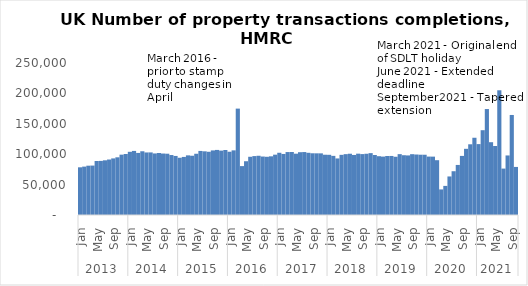
| Category | Series 0 |
|---|---|
| 0 | 78440 |
| 1 | 79580 |
| 2 | 81100 |
| 3 | 81280 |
| 4 | 88860 |
| 5 | 88970 |
| 6 | 89950 |
| 7 | 91250 |
| 8 | 93090 |
| 9 | 94890 |
| 10 | 99240 |
| 11 | 100330 |
| 12 | 103940 |
| 13 | 105390 |
| 14 | 102090 |
| 15 | 104820 |
| 16 | 102860 |
| 17 | 102930 |
| 18 | 101230 |
| 19 | 102020 |
| 20 | 101100 |
| 21 | 100800 |
| 22 | 98630 |
| 23 | 97130 |
| 24 | 94140 |
| 25 | 95520 |
| 26 | 98080 |
| 27 | 97470 |
| 28 | 100720 |
| 29 | 105360 |
| 30 | 104740 |
| 31 | 103990 |
| 32 | 106230 |
| 33 | 107030 |
| 34 | 105880 |
| 35 | 106870 |
| 36 | 104030 |
| 37 | 106340 |
| 38 | 174980 |
| 39 | 80430 |
| 40 | 88440 |
| 41 | 95770 |
| 42 | 96910 |
| 43 | 97430 |
| 44 | 96170 |
| 45 | 95750 |
| 46 | 96510 |
| 47 | 99220 |
| 48 | 102360 |
| 49 | 100400 |
| 50 | 103510 |
| 51 | 103620 |
| 52 | 100820 |
| 53 | 103280 |
| 54 | 103530 |
| 55 | 102310 |
| 56 | 101510 |
| 57 | 101430 |
| 58 | 101390 |
| 59 | 99140 |
| 60 | 99010 |
| 61 | 97250 |
| 62 | 93020 |
| 63 | 98940 |
| 64 | 100080 |
| 65 | 100770 |
| 66 | 98770 |
| 67 | 100870 |
| 68 | 100180 |
| 69 | 100730 |
| 70 | 101760 |
| 71 | 98650 |
| 72 | 96710 |
| 73 | 96080 |
| 74 | 97030 |
| 75 | 97120 |
| 76 | 95790 |
| 77 | 100090 |
| 78 | 98320 |
| 79 | 97990 |
| 80 | 100030 |
| 81 | 99500 |
| 82 | 99150 |
| 83 | 99110 |
| 84 | 96090 |
| 85 | 96010 |
| 86 | 90140 |
| 87 | 42070 |
| 88 | 47870 |
| 89 | 63400 |
| 90 | 72000 |
| 91 | 82330 |
| 92 | 97190 |
| 93 | 108850 |
| 94 | 116300 |
| 95 | 127050 |
| 96 | 116610 |
| 97 | 139480 |
| 98 | 174260 |
| 99 | 119730 |
| 100 | 113530 |
| 101 | 205140 |
| 102 | 76340 |
| 103 | 97940 |
| 104 | 164530 |
| 105 | 79060 |